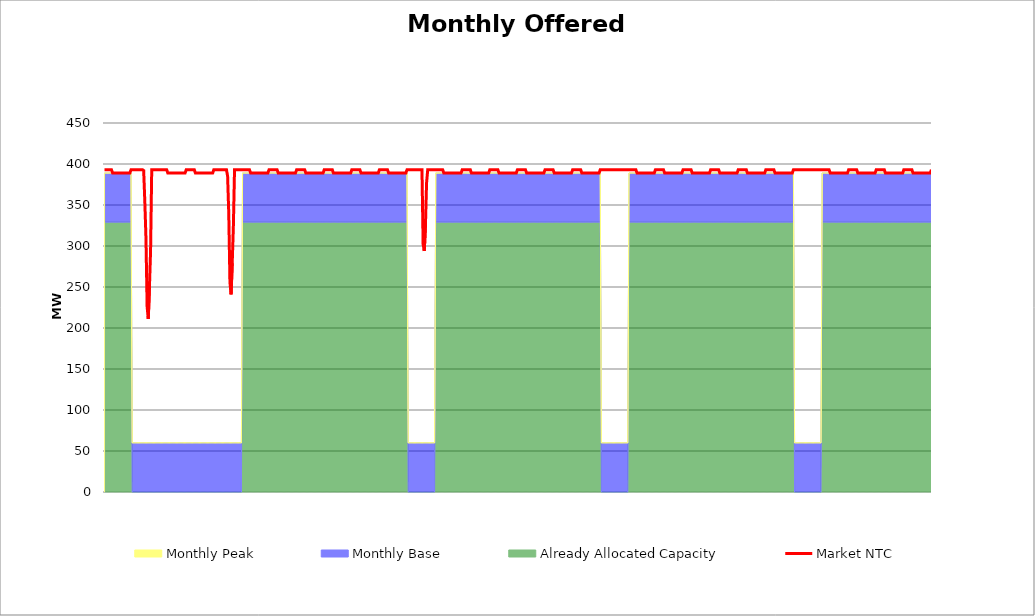
| Category | Market NTC |
|---|---|
| 0 | 393 |
| 1 | 393 |
| 2 | 393 |
| 3 | 393 |
| 4 | 393 |
| 5 | 393 |
| 6 | 393 |
| 7 | 389 |
| 8 | 389 |
| 9 | 389 |
| 10 | 389 |
| 11 | 389 |
| 12 | 389 |
| 13 | 389 |
| 14 | 389 |
| 15 | 389 |
| 16 | 389 |
| 17 | 389 |
| 18 | 389 |
| 19 | 389 |
| 20 | 389 |
| 21 | 389 |
| 22 | 389 |
| 23 | 393 |
| 24 | 393 |
| 25 | 393 |
| 26 | 393 |
| 27 | 393 |
| 28 | 393 |
| 29 | 393 |
| 30 | 393 |
| 31 | 393 |
| 32 | 393 |
| 33 | 393 |
| 34 | 392 |
| 35 | 354 |
| 36 | 309 |
| 37 | 226 |
| 38 | 211 |
| 39 | 249 |
| 40 | 294 |
| 41 | 393 |
| 42 | 393 |
| 43 | 393 |
| 44 | 393 |
| 45 | 393 |
| 46 | 393 |
| 47 | 393 |
| 48 | 393 |
| 49 | 393 |
| 50 | 393 |
| 51 | 393 |
| 52 | 393 |
| 53 | 393 |
| 54 | 393 |
| 55 | 389 |
| 56 | 389 |
| 57 | 389 |
| 58 | 389 |
| 59 | 389 |
| 60 | 389 |
| 61 | 389 |
| 62 | 389 |
| 63 | 389 |
| 64 | 389 |
| 65 | 389 |
| 66 | 389 |
| 67 | 389 |
| 68 | 389 |
| 69 | 389 |
| 70 | 389 |
| 71 | 393 |
| 72 | 393 |
| 73 | 393 |
| 74 | 393 |
| 75 | 393 |
| 76 | 393 |
| 77 | 393 |
| 78 | 393 |
| 79 | 389 |
| 80 | 389 |
| 81 | 389 |
| 82 | 389 |
| 83 | 389 |
| 84 | 389 |
| 85 | 389 |
| 86 | 389 |
| 87 | 389 |
| 88 | 389 |
| 89 | 389 |
| 90 | 389 |
| 91 | 389 |
| 92 | 389 |
| 93 | 389 |
| 94 | 389 |
| 95 | 393 |
| 96 | 393 |
| 97 | 393 |
| 98 | 393 |
| 99 | 393 |
| 100 | 393 |
| 101 | 393 |
| 102 | 393 |
| 103 | 393 |
| 104 | 393 |
| 105 | 393 |
| 106 | 393 |
| 107 | 385 |
| 108 | 339 |
| 109 | 256 |
| 110 | 241 |
| 111 | 279 |
| 112 | 324 |
| 113 | 393 |
| 114 | 393 |
| 115 | 393 |
| 116 | 393 |
| 117 | 393 |
| 118 | 393 |
| 119 | 393 |
| 120 | 393 |
| 121 | 393 |
| 122 | 393 |
| 123 | 393 |
| 124 | 393 |
| 125 | 393 |
| 126 | 393 |
| 127 | 389 |
| 128 | 389 |
| 129 | 389 |
| 130 | 389 |
| 131 | 389 |
| 132 | 389 |
| 133 | 389 |
| 134 | 389 |
| 135 | 389 |
| 136 | 389 |
| 137 | 389 |
| 138 | 389 |
| 139 | 389 |
| 140 | 389 |
| 141 | 389 |
| 142 | 389 |
| 143 | 393 |
| 144 | 393 |
| 145 | 393 |
| 146 | 393 |
| 147 | 393 |
| 148 | 393 |
| 149 | 393 |
| 150 | 393 |
| 151 | 389 |
| 152 | 389 |
| 153 | 389 |
| 154 | 389 |
| 155 | 389 |
| 156 | 389 |
| 157 | 389 |
| 158 | 389 |
| 159 | 389 |
| 160 | 389 |
| 161 | 389 |
| 162 | 389 |
| 163 | 389 |
| 164 | 389 |
| 165 | 389 |
| 166 | 389 |
| 167 | 393 |
| 168 | 393 |
| 169 | 393 |
| 170 | 393 |
| 171 | 393 |
| 172 | 393 |
| 173 | 393 |
| 174 | 393 |
| 175 | 389 |
| 176 | 389 |
| 177 | 389 |
| 178 | 389 |
| 179 | 389 |
| 180 | 389 |
| 181 | 389 |
| 182 | 389 |
| 183 | 389 |
| 184 | 389 |
| 185 | 389 |
| 186 | 389 |
| 187 | 389 |
| 188 | 389 |
| 189 | 389 |
| 190 | 389 |
| 191 | 393 |
| 192 | 393 |
| 193 | 393 |
| 194 | 393 |
| 195 | 393 |
| 196 | 393 |
| 197 | 393 |
| 198 | 393 |
| 199 | 389 |
| 200 | 389 |
| 201 | 389 |
| 202 | 389 |
| 203 | 389 |
| 204 | 389 |
| 205 | 389 |
| 206 | 389 |
| 207 | 389 |
| 208 | 389 |
| 209 | 389 |
| 210 | 389 |
| 211 | 389 |
| 212 | 389 |
| 213 | 389 |
| 214 | 389 |
| 215 | 393 |
| 216 | 393 |
| 217 | 393 |
| 218 | 393 |
| 219 | 393 |
| 220 | 393 |
| 221 | 393 |
| 222 | 393 |
| 223 | 389 |
| 224 | 389 |
| 225 | 389 |
| 226 | 389 |
| 227 | 389 |
| 228 | 389 |
| 229 | 389 |
| 230 | 389 |
| 231 | 389 |
| 232 | 389 |
| 233 | 389 |
| 234 | 389 |
| 235 | 389 |
| 236 | 389 |
| 237 | 389 |
| 238 | 389 |
| 239 | 393 |
| 240 | 393 |
| 241 | 393 |
| 242 | 393 |
| 243 | 393 |
| 244 | 393 |
| 245 | 393 |
| 246 | 393 |
| 247 | 389 |
| 248 | 389 |
| 249 | 389 |
| 250 | 389 |
| 251 | 389 |
| 252 | 389 |
| 253 | 389 |
| 254 | 389 |
| 255 | 389 |
| 256 | 389 |
| 257 | 389 |
| 258 | 389 |
| 259 | 389 |
| 260 | 389 |
| 261 | 389 |
| 262 | 389 |
| 263 | 393 |
| 264 | 393 |
| 265 | 393 |
| 266 | 393 |
| 267 | 393 |
| 268 | 393 |
| 269 | 393 |
| 270 | 393 |
| 271 | 393 |
| 272 | 393 |
| 273 | 393 |
| 274 | 393 |
| 275 | 393 |
| 276 | 393 |
| 277 | 302 |
| 278 | 294 |
| 279 | 324 |
| 280 | 377 |
| 281 | 393 |
| 282 | 393 |
| 283 | 393 |
| 284 | 393 |
| 285 | 393 |
| 286 | 393 |
| 287 | 393 |
| 288 | 393 |
| 289 | 393 |
| 290 | 393 |
| 291 | 393 |
| 292 | 393 |
| 293 | 393 |
| 294 | 393 |
| 295 | 389 |
| 296 | 389 |
| 297 | 389 |
| 298 | 389 |
| 299 | 389 |
| 300 | 389 |
| 301 | 389 |
| 302 | 389 |
| 303 | 389 |
| 304 | 389 |
| 305 | 389 |
| 306 | 389 |
| 307 | 389 |
| 308 | 389 |
| 309 | 389 |
| 310 | 389 |
| 311 | 393 |
| 312 | 393 |
| 313 | 393 |
| 314 | 393 |
| 315 | 393 |
| 316 | 393 |
| 317 | 393 |
| 318 | 393 |
| 319 | 389 |
| 320 | 389 |
| 321 | 389 |
| 322 | 389 |
| 323 | 389 |
| 324 | 389 |
| 325 | 389 |
| 326 | 389 |
| 327 | 389 |
| 328 | 389 |
| 329 | 389 |
| 330 | 389 |
| 331 | 389 |
| 332 | 389 |
| 333 | 389 |
| 334 | 389 |
| 335 | 393 |
| 336 | 393 |
| 337 | 393 |
| 338 | 393 |
| 339 | 393 |
| 340 | 393 |
| 341 | 393 |
| 342 | 393 |
| 343 | 389 |
| 344 | 389 |
| 345 | 389 |
| 346 | 389 |
| 347 | 389 |
| 348 | 389 |
| 349 | 389 |
| 350 | 389 |
| 351 | 389 |
| 352 | 389 |
| 353 | 389 |
| 354 | 389 |
| 355 | 389 |
| 356 | 389 |
| 357 | 389 |
| 358 | 389 |
| 359 | 393 |
| 360 | 393 |
| 361 | 393 |
| 362 | 393 |
| 363 | 393 |
| 364 | 393 |
| 365 | 393 |
| 366 | 393 |
| 367 | 389 |
| 368 | 389 |
| 369 | 389 |
| 370 | 389 |
| 371 | 389 |
| 372 | 389 |
| 373 | 389 |
| 374 | 389 |
| 375 | 389 |
| 376 | 389 |
| 377 | 389 |
| 378 | 389 |
| 379 | 389 |
| 380 | 389 |
| 381 | 389 |
| 382 | 389 |
| 383 | 393 |
| 384 | 393 |
| 385 | 393 |
| 386 | 393 |
| 387 | 393 |
| 388 | 393 |
| 389 | 393 |
| 390 | 393 |
| 391 | 389 |
| 392 | 389 |
| 393 | 389 |
| 394 | 389 |
| 395 | 389 |
| 396 | 389 |
| 397 | 389 |
| 398 | 389 |
| 399 | 389 |
| 400 | 389 |
| 401 | 389 |
| 402 | 389 |
| 403 | 389 |
| 404 | 389 |
| 405 | 389 |
| 406 | 389 |
| 407 | 393 |
| 408 | 393 |
| 409 | 393 |
| 410 | 393 |
| 411 | 393 |
| 412 | 393 |
| 413 | 393 |
| 414 | 393 |
| 415 | 389 |
| 416 | 389 |
| 417 | 389 |
| 418 | 389 |
| 419 | 389 |
| 420 | 389 |
| 421 | 389 |
| 422 | 389 |
| 423 | 389 |
| 424 | 389 |
| 425 | 389 |
| 426 | 389 |
| 427 | 389 |
| 428 | 389 |
| 429 | 389 |
| 430 | 389 |
| 431 | 393 |
| 432 | 393 |
| 433 | 393 |
| 434 | 393 |
| 435 | 393 |
| 436 | 393 |
| 437 | 393 |
| 438 | 393 |
| 439 | 393 |
| 440 | 393 |
| 441 | 393 |
| 442 | 393 |
| 443 | 393 |
| 444 | 393 |
| 445 | 393 |
| 446 | 393 |
| 447 | 393 |
| 448 | 393 |
| 449 | 393 |
| 450 | 393 |
| 451 | 393 |
| 452 | 393 |
| 453 | 393 |
| 454 | 393 |
| 455 | 393 |
| 456 | 393 |
| 457 | 393 |
| 458 | 393 |
| 459 | 393 |
| 460 | 393 |
| 461 | 393 |
| 462 | 393 |
| 463 | 389 |
| 464 | 389 |
| 465 | 389 |
| 466 | 389 |
| 467 | 389 |
| 468 | 389 |
| 469 | 389 |
| 470 | 389 |
| 471 | 389 |
| 472 | 389 |
| 473 | 389 |
| 474 | 389 |
| 475 | 389 |
| 476 | 389 |
| 477 | 389 |
| 478 | 389 |
| 479 | 393 |
| 480 | 393 |
| 481 | 393 |
| 482 | 393 |
| 483 | 393 |
| 484 | 393 |
| 485 | 393 |
| 486 | 393 |
| 487 | 389 |
| 488 | 389 |
| 489 | 389 |
| 490 | 389 |
| 491 | 389 |
| 492 | 389 |
| 493 | 389 |
| 494 | 389 |
| 495 | 389 |
| 496 | 389 |
| 497 | 389 |
| 498 | 389 |
| 499 | 389 |
| 500 | 389 |
| 501 | 389 |
| 502 | 389 |
| 503 | 393 |
| 504 | 393 |
| 505 | 393 |
| 506 | 393 |
| 507 | 393 |
| 508 | 393 |
| 509 | 393 |
| 510 | 393 |
| 511 | 389 |
| 512 | 389 |
| 513 | 389 |
| 514 | 389 |
| 515 | 389 |
| 516 | 389 |
| 517 | 389 |
| 518 | 389 |
| 519 | 389 |
| 520 | 389 |
| 521 | 389 |
| 522 | 389 |
| 523 | 389 |
| 524 | 389 |
| 525 | 389 |
| 526 | 389 |
| 527 | 393 |
| 528 | 393 |
| 529 | 393 |
| 530 | 393 |
| 531 | 393 |
| 532 | 393 |
| 533 | 393 |
| 534 | 393 |
| 535 | 389 |
| 536 | 389 |
| 537 | 389 |
| 538 | 389 |
| 539 | 389 |
| 540 | 389 |
| 541 | 389 |
| 542 | 389 |
| 543 | 389 |
| 544 | 389 |
| 545 | 389 |
| 546 | 389 |
| 547 | 389 |
| 548 | 389 |
| 549 | 389 |
| 550 | 389 |
| 551 | 393 |
| 552 | 393 |
| 553 | 393 |
| 554 | 393 |
| 555 | 393 |
| 556 | 393 |
| 557 | 393 |
| 558 | 393 |
| 559 | 389 |
| 560 | 389 |
| 561 | 389 |
| 562 | 389 |
| 563 | 389 |
| 564 | 389 |
| 565 | 389 |
| 566 | 389 |
| 567 | 389 |
| 568 | 389 |
| 569 | 389 |
| 570 | 389 |
| 571 | 389 |
| 572 | 389 |
| 573 | 389 |
| 574 | 389 |
| 575 | 393 |
| 576 | 393 |
| 577 | 393 |
| 578 | 393 |
| 579 | 393 |
| 580 | 393 |
| 581 | 393 |
| 582 | 393 |
| 583 | 389 |
| 584 | 389 |
| 585 | 389 |
| 586 | 389 |
| 587 | 389 |
| 588 | 389 |
| 589 | 389 |
| 590 | 389 |
| 591 | 389 |
| 592 | 389 |
| 593 | 389 |
| 594 | 389 |
| 595 | 389 |
| 596 | 389 |
| 597 | 389 |
| 598 | 389 |
| 599 | 393 |
| 600 | 393 |
| 601 | 393 |
| 602 | 393 |
| 603 | 393 |
| 604 | 393 |
| 605 | 393 |
| 606 | 393 |
| 607 | 393 |
| 608 | 393 |
| 609 | 393 |
| 610 | 393 |
| 611 | 393 |
| 612 | 393 |
| 613 | 393 |
| 614 | 393 |
| 615 | 393 |
| 616 | 393 |
| 617 | 393 |
| 618 | 393 |
| 619 | 393 |
| 620 | 393 |
| 621 | 393 |
| 622 | 393 |
| 623 | 393 |
| 624 | 393 |
| 625 | 393 |
| 626 | 393 |
| 627 | 393 |
| 628 | 393 |
| 629 | 393 |
| 630 | 393 |
| 631 | 389 |
| 632 | 389 |
| 633 | 389 |
| 634 | 389 |
| 635 | 389 |
| 636 | 389 |
| 637 | 389 |
| 638 | 389 |
| 639 | 389 |
| 640 | 389 |
| 641 | 389 |
| 642 | 389 |
| 643 | 389 |
| 644 | 389 |
| 645 | 389 |
| 646 | 389 |
| 647 | 393 |
| 648 | 393 |
| 649 | 393 |
| 650 | 393 |
| 651 | 393 |
| 652 | 393 |
| 653 | 393 |
| 654 | 393 |
| 655 | 389 |
| 656 | 389 |
| 657 | 389 |
| 658 | 389 |
| 659 | 389 |
| 660 | 389 |
| 661 | 389 |
| 662 | 389 |
| 663 | 389 |
| 664 | 389 |
| 665 | 389 |
| 666 | 389 |
| 667 | 389 |
| 668 | 389 |
| 669 | 389 |
| 670 | 389 |
| 671 | 393 |
| 672 | 393 |
| 673 | 393 |
| 674 | 393 |
| 675 | 393 |
| 676 | 393 |
| 677 | 393 |
| 678 | 393 |
| 679 | 389 |
| 680 | 389 |
| 681 | 389 |
| 682 | 389 |
| 683 | 389 |
| 684 | 389 |
| 685 | 389 |
| 686 | 389 |
| 687 | 389 |
| 688 | 389 |
| 689 | 389 |
| 690 | 389 |
| 691 | 389 |
| 692 | 389 |
| 693 | 389 |
| 694 | 389 |
| 695 | 393 |
| 696 | 393 |
| 697 | 393 |
| 698 | 393 |
| 699 | 393 |
| 700 | 393 |
| 701 | 393 |
| 702 | 393 |
| 703 | 389 |
| 704 | 389 |
| 705 | 389 |
| 706 | 389 |
| 707 | 389 |
| 708 | 389 |
| 709 | 389 |
| 710 | 389 |
| 711 | 389 |
| 712 | 389 |
| 713 | 389 |
| 714 | 389 |
| 715 | 389 |
| 716 | 389 |
| 717 | 389 |
| 718 | 389 |
| 719 | 393 |